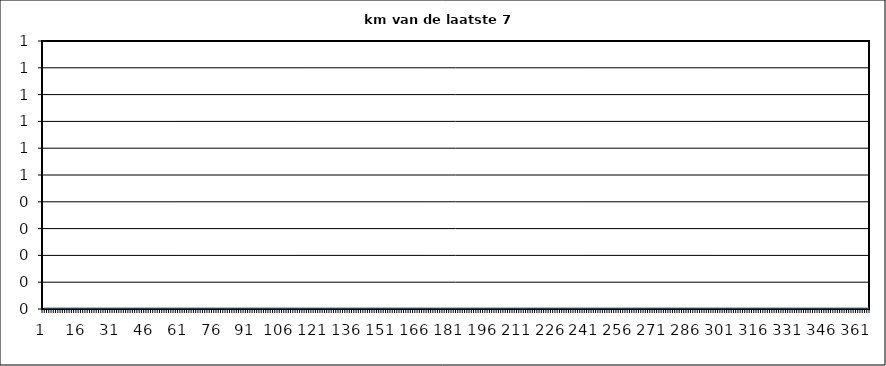
| Category | Series 0 |
|---|---|
| 0 | 0 |
| 1 | 0 |
| 2 | 0 |
| 3 | 0 |
| 4 | 0 |
| 5 | 0 |
| 6 | 0 |
| 7 | 0 |
| 8 | 0 |
| 9 | 0 |
| 10 | 0 |
| 11 | 0 |
| 12 | 0 |
| 13 | 0 |
| 14 | 0 |
| 15 | 0 |
| 16 | 0 |
| 17 | 0 |
| 18 | 0 |
| 19 | 0 |
| 20 | 0 |
| 21 | 0 |
| 22 | 0 |
| 23 | 0 |
| 24 | 0 |
| 25 | 0 |
| 26 | 0 |
| 27 | 0 |
| 28 | 0 |
| 29 | 0 |
| 30 | 0 |
| 31 | 0 |
| 32 | 0 |
| 33 | 0 |
| 34 | 0 |
| 35 | 0 |
| 36 | 0 |
| 37 | 0 |
| 38 | 0 |
| 39 | 0 |
| 40 | 0 |
| 41 | 0 |
| 42 | 0 |
| 43 | 0 |
| 44 | 0 |
| 45 | 0 |
| 46 | 0 |
| 47 | 0 |
| 48 | 0 |
| 49 | 0 |
| 50 | 0 |
| 51 | 0 |
| 52 | 0 |
| 53 | 0 |
| 54 | 0 |
| 55 | 0 |
| 56 | 0 |
| 57 | 0 |
| 58 | 0 |
| 59 | 0 |
| 60 | 0 |
| 61 | 0 |
| 62 | 0 |
| 63 | 0 |
| 64 | 0 |
| 65 | 0 |
| 66 | 0 |
| 67 | 0 |
| 68 | 0 |
| 69 | 0 |
| 70 | 0 |
| 71 | 0 |
| 72 | 0 |
| 73 | 0 |
| 74 | 0 |
| 75 | 0 |
| 76 | 0 |
| 77 | 0 |
| 78 | 0 |
| 79 | 0 |
| 80 | 0 |
| 81 | 0 |
| 82 | 0 |
| 83 | 0 |
| 84 | 0 |
| 85 | 0 |
| 86 | 0 |
| 87 | 0 |
| 88 | 0 |
| 89 | 0 |
| 90 | 0 |
| 91 | 0 |
| 92 | 0 |
| 93 | 0 |
| 94 | 0 |
| 95 | 0 |
| 96 | 0 |
| 97 | 0 |
| 98 | 0 |
| 99 | 0 |
| 100 | 0 |
| 101 | 0 |
| 102 | 0 |
| 103 | 0 |
| 104 | 0 |
| 105 | 0 |
| 106 | 0 |
| 107 | 0 |
| 108 | 0 |
| 109 | 0 |
| 110 | 0 |
| 111 | 0 |
| 112 | 0 |
| 113 | 0 |
| 114 | 0 |
| 115 | 0 |
| 116 | 0 |
| 117 | 0 |
| 118 | 0 |
| 119 | 0 |
| 120 | 0 |
| 121 | 0 |
| 122 | 0 |
| 123 | 0 |
| 124 | 0 |
| 125 | 0 |
| 126 | 0 |
| 127 | 0 |
| 128 | 0 |
| 129 | 0 |
| 130 | 0 |
| 131 | 0 |
| 132 | 0 |
| 133 | 0 |
| 134 | 0 |
| 135 | 0 |
| 136 | 0 |
| 137 | 0 |
| 138 | 0 |
| 139 | 0 |
| 140 | 0 |
| 141 | 0 |
| 142 | 0 |
| 143 | 0 |
| 144 | 0 |
| 145 | 0 |
| 146 | 0 |
| 147 | 0 |
| 148 | 0 |
| 149 | 0 |
| 150 | 0 |
| 151 | 0 |
| 152 | 0 |
| 153 | 0 |
| 154 | 0 |
| 155 | 0 |
| 156 | 0 |
| 157 | 0 |
| 158 | 0 |
| 159 | 0 |
| 160 | 0 |
| 161 | 0 |
| 162 | 0 |
| 163 | 0 |
| 164 | 0 |
| 165 | 0 |
| 166 | 0 |
| 167 | 0 |
| 168 | 0 |
| 169 | 0 |
| 170 | 0 |
| 171 | 0 |
| 172 | 0 |
| 173 | 0 |
| 174 | 0 |
| 175 | 0 |
| 176 | 0 |
| 177 | 0 |
| 178 | 0 |
| 179 | 0 |
| 180 | 0 |
| 181 | 0 |
| 182 | 0 |
| 183 | 0 |
| 184 | 0 |
| 185 | 0 |
| 186 | 0 |
| 187 | 0 |
| 188 | 0 |
| 189 | 0 |
| 190 | 0 |
| 191 | 0 |
| 192 | 0 |
| 193 | 0 |
| 194 | 0 |
| 195 | 0 |
| 196 | 0 |
| 197 | 0 |
| 198 | 0 |
| 199 | 0 |
| 200 | 0 |
| 201 | 0 |
| 202 | 0 |
| 203 | 0 |
| 204 | 0 |
| 205 | 0 |
| 206 | 0 |
| 207 | 0 |
| 208 | 0 |
| 209 | 0 |
| 210 | 0 |
| 211 | 0 |
| 212 | 0 |
| 213 | 0 |
| 214 | 0 |
| 215 | 0 |
| 216 | 0 |
| 217 | 0 |
| 218 | 0 |
| 219 | 0 |
| 220 | 0 |
| 221 | 0 |
| 222 | 0 |
| 223 | 0 |
| 224 | 0 |
| 225 | 0 |
| 226 | 0 |
| 227 | 0 |
| 228 | 0 |
| 229 | 0 |
| 230 | 0 |
| 231 | 0 |
| 232 | 0 |
| 233 | 0 |
| 234 | 0 |
| 235 | 0 |
| 236 | 0 |
| 237 | 0 |
| 238 | 0 |
| 239 | 0 |
| 240 | 0 |
| 241 | 0 |
| 242 | 0 |
| 243 | 0 |
| 244 | 0 |
| 245 | 0 |
| 246 | 0 |
| 247 | 0 |
| 248 | 0 |
| 249 | 0 |
| 250 | 0 |
| 251 | 0 |
| 252 | 0 |
| 253 | 0 |
| 254 | 0 |
| 255 | 0 |
| 256 | 0 |
| 257 | 0 |
| 258 | 0 |
| 259 | 0 |
| 260 | 0 |
| 261 | 0 |
| 262 | 0 |
| 263 | 0 |
| 264 | 0 |
| 265 | 0 |
| 266 | 0 |
| 267 | 0 |
| 268 | 0 |
| 269 | 0 |
| 270 | 0 |
| 271 | 0 |
| 272 | 0 |
| 273 | 0 |
| 274 | 0 |
| 275 | 0 |
| 276 | 0 |
| 277 | 0 |
| 278 | 0 |
| 279 | 0 |
| 280 | 0 |
| 281 | 0 |
| 282 | 0 |
| 283 | 0 |
| 284 | 0 |
| 285 | 0 |
| 286 | 0 |
| 287 | 0 |
| 288 | 0 |
| 289 | 0 |
| 290 | 0 |
| 291 | 0 |
| 292 | 0 |
| 293 | 0 |
| 294 | 0 |
| 295 | 0 |
| 296 | 0 |
| 297 | 0 |
| 298 | 0 |
| 299 | 0 |
| 300 | 0 |
| 301 | 0 |
| 302 | 0 |
| 303 | 0 |
| 304 | 0 |
| 305 | 0 |
| 306 | 0 |
| 307 | 0 |
| 308 | 0 |
| 309 | 0 |
| 310 | 0 |
| 311 | 0 |
| 312 | 0 |
| 313 | 0 |
| 314 | 0 |
| 315 | 0 |
| 316 | 0 |
| 317 | 0 |
| 318 | 0 |
| 319 | 0 |
| 320 | 0 |
| 321 | 0 |
| 322 | 0 |
| 323 | 0 |
| 324 | 0 |
| 325 | 0 |
| 326 | 0 |
| 327 | 0 |
| 328 | 0 |
| 329 | 0 |
| 330 | 0 |
| 331 | 0 |
| 332 | 0 |
| 333 | 0 |
| 334 | 0 |
| 335 | 0 |
| 336 | 0 |
| 337 | 0 |
| 338 | 0 |
| 339 | 0 |
| 340 | 0 |
| 341 | 0 |
| 342 | 0 |
| 343 | 0 |
| 344 | 0 |
| 345 | 0 |
| 346 | 0 |
| 347 | 0 |
| 348 | 0 |
| 349 | 0 |
| 350 | 0 |
| 351 | 0 |
| 352 | 0 |
| 353 | 0 |
| 354 | 0 |
| 355 | 0 |
| 356 | 0 |
| 357 | 0 |
| 358 | 0 |
| 359 | 0 |
| 360 | 0 |
| 361 | 0 |
| 362 | 0 |
| 363 | 0 |
| 364 | 0 |
| 365 | 0 |